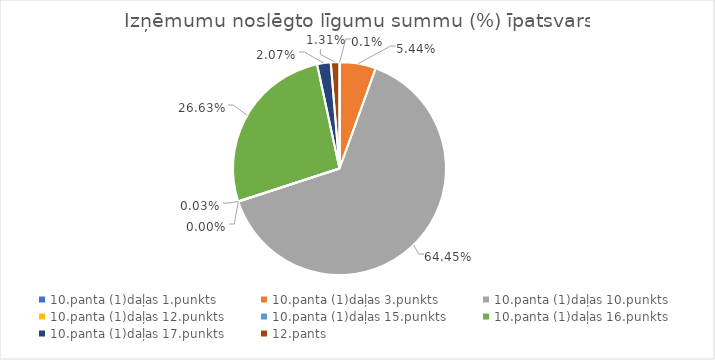
| Category | Īpatsvars (%) |
|---|---|
| 10.panta (1)daļas 1.punkts | 0.001 |
| 10.panta (1)daļas 3.punkts | 0.054 |
| 10.panta (1)daļas 10.punkts | 0.644 |
| 10.panta (1)daļas 12.punkts | 0 |
| 10.panta (1)daļas 15.punkts | 0 |
| 10.panta (1)daļas 16.punkts | 0.266 |
| 10.panta (1)daļas 17.punkts | 0.021 |
| 12.pants | 0.013 |